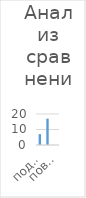
| Category | Series 0 |
|---|---|
| подтвердил | 7 |
| понизил | 17 |
| повысил | 0 |